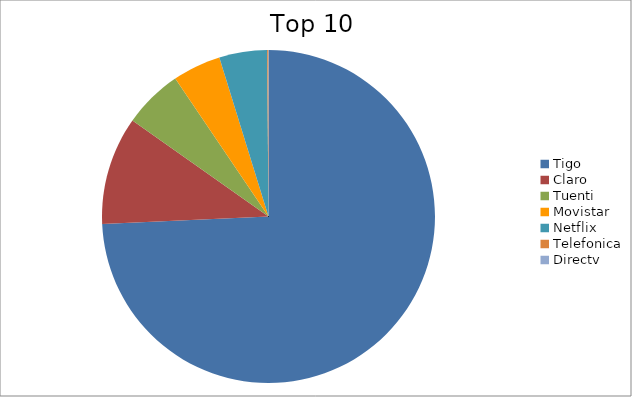
| Category | Series 0 |
|---|---|
| Tigo | 74.27 |
| Claro | 10.5 |
| Tuenti | 5.76 |
| Movistar | 4.69 |
| Netflix | 4.64 |
| Telefonica | 0.11 |
| Directv | 0.02 |